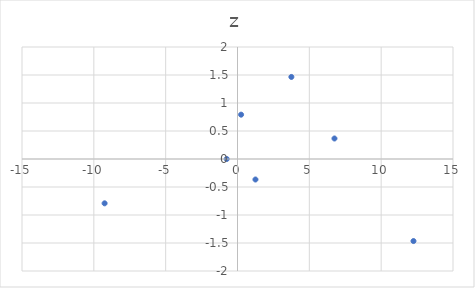
| Category | z |
|---|---|
| 12.25 | -1.465 |
| -9.25 | -0.792 |
| 1.25 | -0.366 |
| -0.75 | 0 |
| 6.75 | 0.366 |
| 0.25 | 0.792 |
| 3.75 | 1.465 |